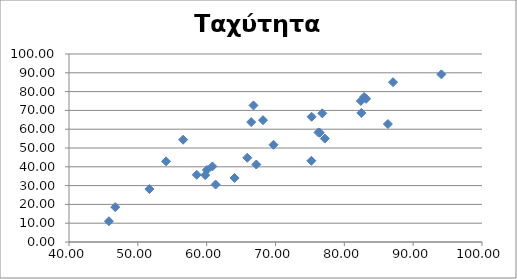
| Category | Ταχύτητα αέρα |
|---|---|
| 67.21 | 41.22 |
| 76.24 | 58.29 |
| 75.25 | 66.6 |
| 59.79 | 35.55 |
| 58.56 | 35.75 |
| 76.8 | 68.45 |
| 66.8 | 72.66 |
| 87.08 | 85.01 |
| 82.4 | 75.02 |
| 77.17 | 55.01 |
| 51.68 | 28.17 |
| 76.43 | 58.12 |
| 60.03 | 38.29 |
| 64.05 | 34.06 |
| 82.47 | 68.65 |
| 83.16 | 76.16 |
| 86.33 | 62.73 |
| 54.1 | 42.9 |
| 75.21 | 43.2 |
| 61.3 | 30.55 |
| 45.8 | 11.04 |
| 66.47 | 63.78 |
| 46.72 | 18.54 |
| 65.9 | 44.82 |
| 60.83 | 40.21 |
| 68.19 | 64.8 |
| 82.87 | 77.13 |
| 94.1 | 89.17 |
| 69.71 | 51.72 |
| 56.58 | 54.4 |